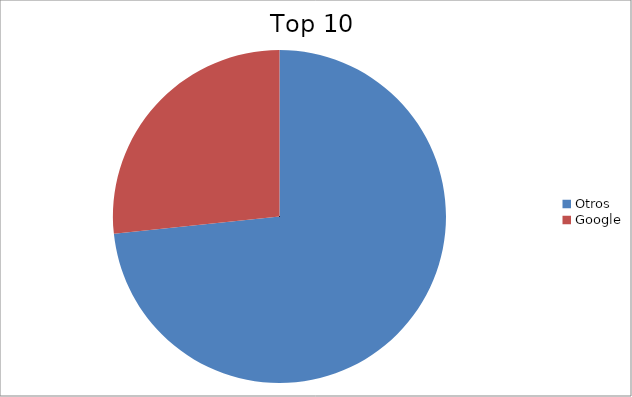
| Category | Series 0 |
|---|---|
| Otros | 73.35 |
| Google | 26.65 |